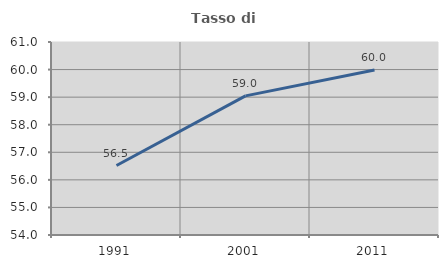
| Category | Tasso di occupazione   |
|---|---|
| 1991.0 | 56.519 |
| 2001.0 | 59.047 |
| 2011.0 | 59.984 |